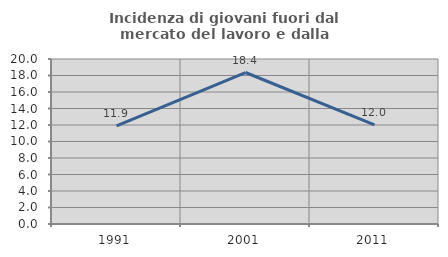
| Category | Incidenza di giovani fuori dal mercato del lavoro e dalla formazione  |
|---|---|
| 1991.0 | 11.889 |
| 2001.0 | 18.362 |
| 2011.0 | 12.003 |